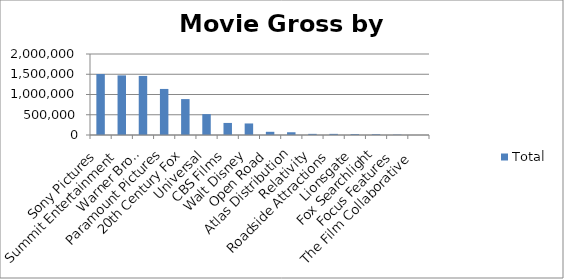
| Category | Total |
|---|---|
| Sony Pictures | 1505482 |
| Summit Entertainment | 1471707 |
| Warner Bros. | 1458612 |
| Paramount Pictures | 1137316 |
| 20th Century Fox | 886750 |
| Universal | 515370 |
| CBS Films | 297901 |
| Walt Disney | 284963 |
| Open Road | 78956 |
| Atlas Distribution | 68003 |
| Relativity | 28021 |
| Roadside Attractions | 27965 |
| Lionsgate | 21626 |
| Fox Searchlight | 18350 |
| Focus Features | 8661 |
| The Film Collaborative  | 288 |